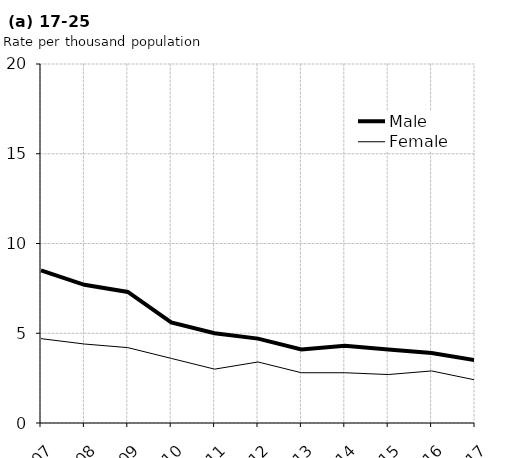
| Category | Male | Female |
|---|---|---|
| 2007.0 | 8.5 | 4.7 |
| 2008.0 | 7.7 | 4.4 |
| 2009.0 | 7.3 | 4.2 |
| 2010.0 | 5.6 | 3.6 |
| 2011.0 | 5 | 3 |
| 2012.0 | 4.7 | 3.4 |
| 2013.0 | 4.1 | 2.8 |
| 2014.0 | 4.3 | 2.8 |
| 2015.0 | 4.1 | 2.7 |
| 2016.0 | 3.9 | 2.9 |
| 2017.0 | 3.5 | 2.4 |